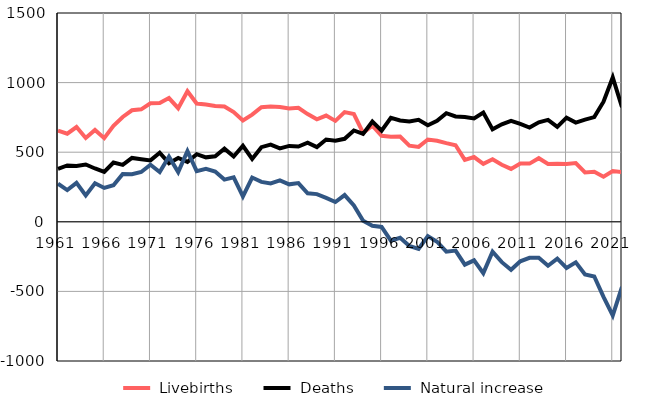
| Category |  Livebirths |  Deaths |  Natural increase |
|---|---|---|---|
| 1961.0 | 655 | 381 | 274 |
| 1962.0 | 633 | 405 | 228 |
| 1963.0 | 681 | 401 | 280 |
| 1964.0 | 602 | 412 | 190 |
| 1965.0 | 660 | 383 | 277 |
| 1966.0 | 601 | 358 | 243 |
| 1967.0 | 689 | 426 | 263 |
| 1968.0 | 753 | 409 | 344 |
| 1969.0 | 801 | 459 | 342 |
| 1970.0 | 808 | 450 | 358 |
| 1971.0 | 851 | 441 | 410 |
| 1972.0 | 854 | 496 | 358 |
| 1973.0 | 889 | 421 | 468 |
| 1974.0 | 816 | 459 | 357 |
| 1975.0 | 938 | 430 | 508 |
| 1976.0 | 850 | 486 | 364 |
| 1977.0 | 843 | 463 | 380 |
| 1978.0 | 832 | 471 | 361 |
| 1979.0 | 828 | 525 | 303 |
| 1980.0 | 788 | 469 | 319 |
| 1981.0 | 728 | 546 | 182 |
| 1982.0 | 770 | 452 | 318 |
| 1983.0 | 823 | 536 | 287 |
| 1984.0 | 829 | 554 | 275 |
| 1985.0 | 824 | 527 | 297 |
| 1986.0 | 814 | 545 | 269 |
| 1987.0 | 819 | 541 | 278 |
| 1988.0 | 774 | 569 | 205 |
| 1989.0 | 736 | 537 | 199 |
| 1990.0 | 763 | 591 | 172 |
| 1991.0 | 725 | 583 | 142 |
| 1992.0 | 788 | 596 | 192 |
| 1993.0 | 774 | 656 | 118 |
| 1994.0 | 638 | 631 | 7 |
| 1995.0 | 691 | 720 | -29 |
| 1996.0 | 618 | 655 | -37 |
| 1997.0 | 611 | 747 | -136 |
| 1998.0 | 613 | 728 | -115 |
| 1999.0 | 547 | 721 | -174 |
| 2000.0 | 538 | 733 | -195 |
| 2001.0 | 591 | 694 | -103 |
| 2002.0 | 582 | 725 | -143 |
| 2003.0 | 565 | 780 | -215 |
| 2004.0 | 550 | 757 | -207 |
| 2005.0 | 445 | 753 | -308 |
| 2006.0 | 465 | 742 | -277 |
| 2007.0 | 416 | 785 | -369 |
| 2008.0 | 449 | 664 | -215 |
| 2009.0 | 410 | 700 | -290 |
| 2010.0 | 380 | 725 | -345 |
| 2011.0 | 419 | 703 | -284 |
| 2012.0 | 418 | 677 | -259 |
| 2013.0 | 457 | 715 | -258 |
| 2014.0 | 416 | 732 | -316 |
| 2015.0 | 417 | 682 | -265 |
| 2016.0 | 416 | 748 | -332 |
| 2017.0 | 422 | 713 | -291 |
| 2018.0 | 355 | 734 | -379 |
| 2019.0 | 359 | 752 | -393 |
| 2020.0 | 324 | 863 | -539 |
| 2021.0 | 364 | 1037 | -673 |
| 2022.0 | 357 | 824 | -467 |